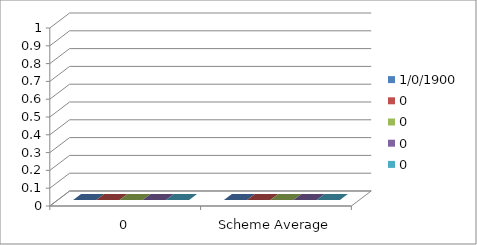
| Category | 00/01/1900 | 0 |
|---|---|---|
| 0 | 0 | 0 |
| Scheme Average | 0 | 0 |